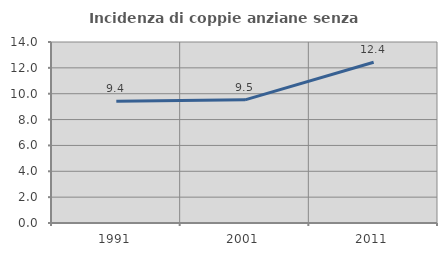
| Category | Incidenza di coppie anziane senza figli  |
|---|---|
| 1991.0 | 9.412 |
| 2001.0 | 9.524 |
| 2011.0 | 12.438 |